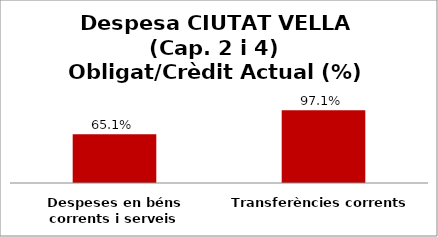
| Category | Series 0 |
|---|---|
| Despeses en béns corrents i serveis | 0.651 |
| Transferències corrents | 0.971 |